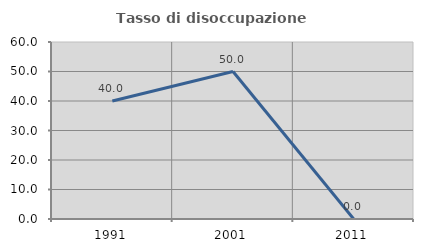
| Category | Tasso di disoccupazione giovanile  |
|---|---|
| 1991.0 | 40 |
| 2001.0 | 50 |
| 2011.0 | 0 |